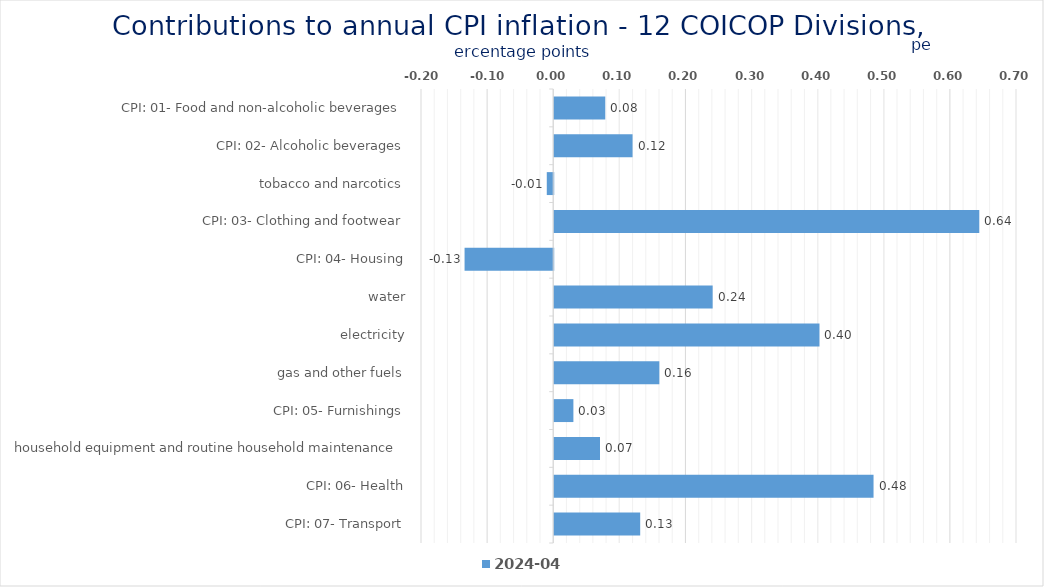
| Category | 2024-04 |
|---|---|
| CPI: 01- Food and non-alcoholic beverages | 0.077 |
| CPI: 02- Alcoholic beverages, tobacco and narcotics | 0.118 |
| CPI: 03- Clothing and footwear | -0.01 |
| CPI: 04- Housing, water, electricity, gas and other fuels | 0.643 |
| CPI: 05- Furnishings, household equipment and routine household maintenance | -0.134 |
| CPI: 06- Health | 0.24 |
| CPI: 07- Transport | 0.401 |
| CPI: 08- Communication | 0.159 |
| CPI: 09- Recreation and culture | 0.029 |
| CPI: 10- Education | 0.069 |
| CPI: 11- Restaurants and hotels | 0.483 |
| CPI: 12- Miscellaneous goods and services | 0.13 |